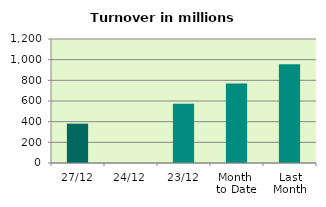
| Category | Series 0 |
|---|---|
| 27/12 | 380.68 |
| 24/12 | 0 |
| 23/12 | 573.134 |
| Month 
to Date | 768.604 |
| Last
Month | 954.978 |